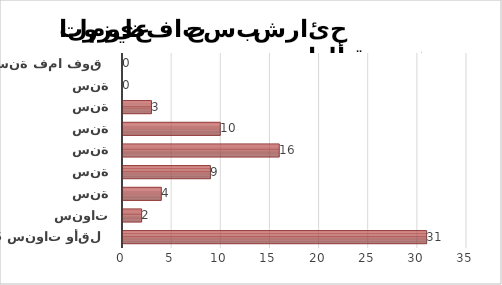
| Category | Series 1 |
|---|---|
| 5 سنوات وأقل | 31 |
| ما بين 6 و10 سنوات | 2 |
| ما بين 11 و 15 سنة | 4 |
| ما بين 16 و20 سنة | 9 |
| ما بين 21 و25 سنة | 16 |
| ما بين 26 و30 سنة | 10 |
| ما بين 31 و35 سنة | 3 |
| ما بين 36 و40 سنة | 0 |
| 41 سنة فما فوق | 0 |